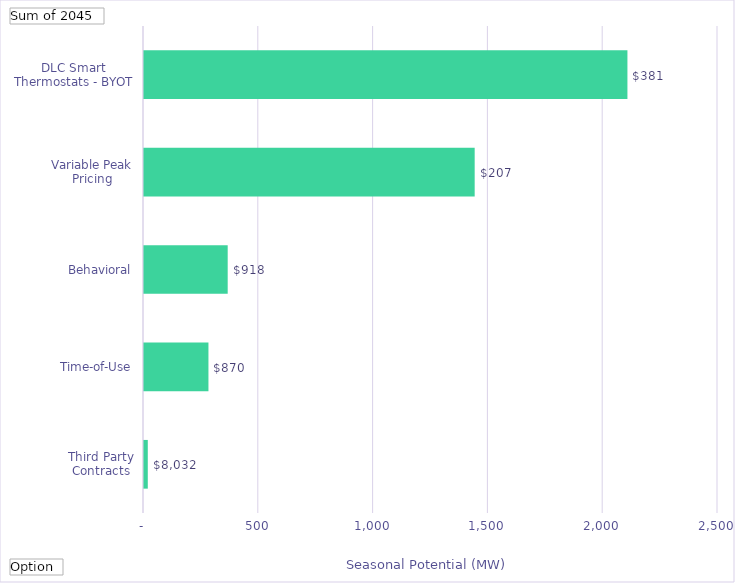
| Category | Winter Peak Reduction @Meter  (Therms) |
|---|---|
| Third Party Contracts | 16.488 |
| Time-of-Use | 280.689 |
| Behavioral | 364.525 |
| Variable Peak Pricing | 1440.258 |
| DLC Smart Thermostats - BYOT | 2105.537 |